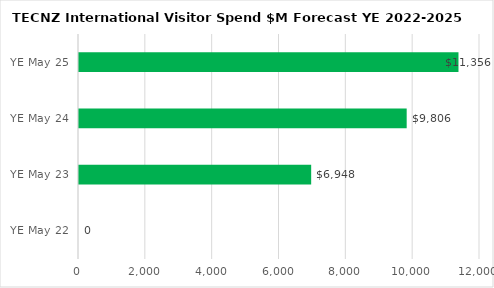
| Category | $M Visitor Spend |
|---|---|
| YE May 22 | 0 |
| YE May 23 | 6948 |
| YE May 24 | 9806 |
| YE May 25 | 11356 |